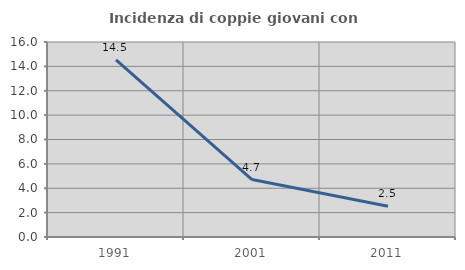
| Category | Incidenza di coppie giovani con figli |
|---|---|
| 1991.0 | 14.53 |
| 2001.0 | 4.717 |
| 2011.0 | 2.525 |